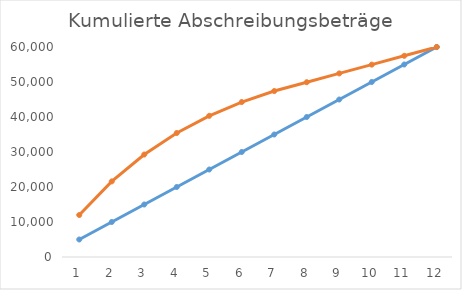
| Category | Kumuliert Linear | Kumuliert Geo-Degressiv |
|---|---|---|
| 0 | 5000 | 12000 |
| 1 | 10000 | 21600 |
| 2 | 15000 | 29280 |
| 3 | 20000 | 35424 |
| 4 | 25000 | 40339.2 |
| 5 | 30000 | 44271.36 |
| 6 | 35000 | 47417.088 |
| 7 | 40000 | 49933.67 |
| 8 | 45000 | 52450.253 |
| 9 | 50000 | 54966.835 |
| 10 | 55000 | 57483.418 |
| 11 | 60000 | 60000 |